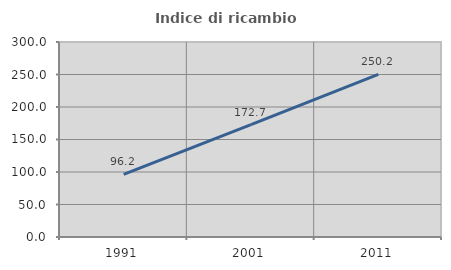
| Category | Indice di ricambio occupazionale  |
|---|---|
| 1991.0 | 96.212 |
| 2001.0 | 172.727 |
| 2011.0 | 250.204 |